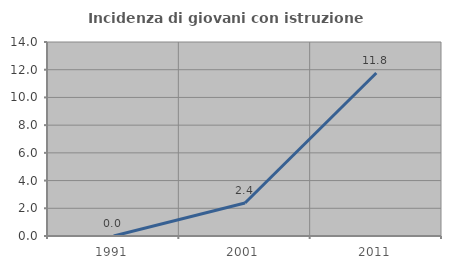
| Category | Incidenza di giovani con istruzione universitaria |
|---|---|
| 1991.0 | 0 |
| 2001.0 | 2.381 |
| 2011.0 | 11.765 |